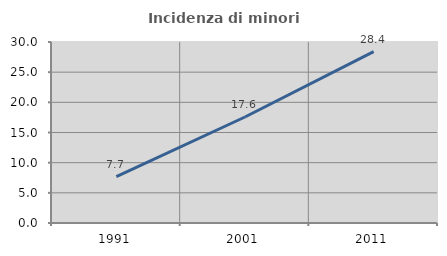
| Category | Incidenza di minori stranieri |
|---|---|
| 1991.0 | 7.692 |
| 2001.0 | 17.568 |
| 2011.0 | 28.415 |